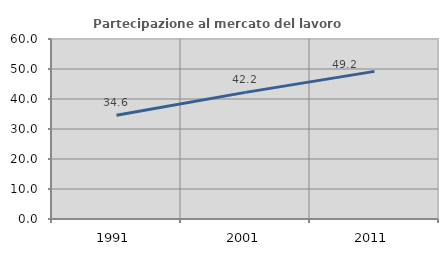
| Category | Partecipazione al mercato del lavoro  femminile |
|---|---|
| 1991.0 | 34.604 |
| 2001.0 | 42.209 |
| 2011.0 | 49.209 |